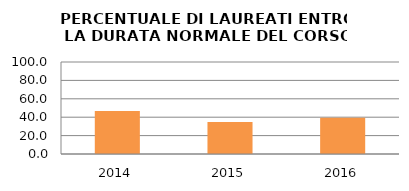
| Category | 2014 2015 2016 |
|---|---|
| 2014.0 | 46.721 |
| 2015.0 | 34.911 |
| 2016.0 | 39.394 |